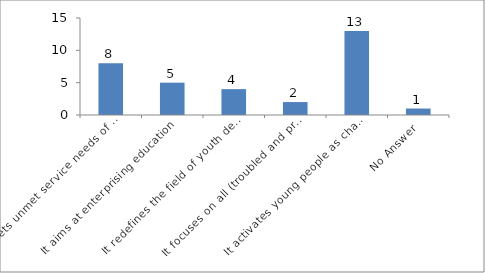
| Category | What did you like the most about the concept of Youth-led Changemaking? |
|---|---|
| It meets unmet service needs of the society | 8 |
| It aims at enterprising education | 5 |
| It redefines the field of youth development | 4 |
| It focuses on all (troubled and prepared) young people | 2 |
| It activates young people as changemakers | 13 |
| No Answer | 1 |